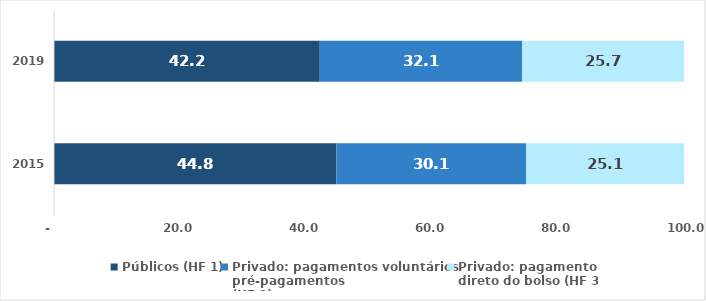
| Category | Públicos (HF 1) | Privado: pagamentos voluntários
pré-pagamentos
(HF 2) | Privado: pagamento
direto do bolso (HF 3) |
|---|---|---|---|
| 2015.0 | 44.815 | 30.103 | 25.082 |
| 2019.0 | 42.185 | 32.139 | 25.677 |